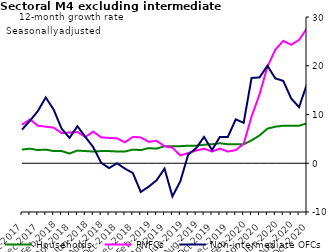
| Category | zero | Households | PNFCs | Non-intermediate OFCs |
|---|---|---|---|---|
| Oct-2017 | 0 | 2.8 | 7.9 | 6.9 |
| Nov-2017 | 0 | 3 | 9 | 8.7 |
| Dec-2017 | 0 | 2.7 | 7.7 | 10.7 |
| Jan-2018 | 0 | 2.8 | 7.5 | 13.5 |
| Feb-2018 | 0 | 2.5 | 7.3 | 11 |
| Mar-2018 | 0 | 2.5 | 6.2 | 7.1 |
| Apr-2018 | 0 | 2 | 6.3 | 5.2 |
| May-2018 | 0 | 2.6 | 6.4 | 7.6 |
| Jun-2018 | 0 | 2.5 | 5.4 | 5.4 |
| Jul-2018 | 0 | 2.4 | 6.5 | 3.3 |
| Aug-2018 | 0 | 2.5 | 5.3 | 0.1 |
| Sep-2018 | 0 | 2.5 | 5.2 | -1 |
| Oct-2018 | 0 | 2.4 | 5.1 | 0 |
| Nov-2018 | 0 | 2.4 | 4.3 | -1.1 |
| Dec-2018 | 0 | 2.8 | 5.4 | -2 |
| Jan-2019 | 0 | 2.7 | 5.3 | -5.9 |
| Feb-2019 | 0 | 3.1 | 4.4 | -4.8 |
| Mar-2019 | 0 | 3 | 4.6 | -3.5 |
| Apr-2019 | 0 | 3.5 | 3.5 | -1.1 |
| May-2019 | 0 | 3.5 | 3.2 | -6.8 |
| Jun-2019 | 0 | 3.5 | 1.6 | -3.7 |
| Jul-2019 | 0 | 3.6 | 2.1 | 1.8 |
| Aug-2019 | 0 | 3.6 | 2.6 | 3.1 |
| Sep-2019 | 0 | 3.8 | 3 | 5.4 |
| Oct-2019 | 0 | 3.9 | 2.4 | 2.7 |
| Nov-2019 | 0 | 4.1 | 3 | 5.4 |
| Dec-2019 | 0 | 3.9 | 2.4 | 5.4 |
| Jan-2020 | 0 | 3.9 | 2.7 | 9 |
| Feb-2020 | 0 | 3.9 | 4 | 8.3 |
| Mar-2020 | 0 | 4.7 | 9.6 | 17.5 |
| Apr-2020 | 0 | 5.7 | 14.1 | 17.6 |
| May-2020 | 0 | 7.1 | 19.8 | 20 |
| Jun-2020 | 0 | 7.5 | 23.3 | 17.4 |
| Jul-2020 | 0 | 7.7 | 25.1 | 16.9 |
| Aug-2020 | 0 | 7.7 | 24.3 | 13.3 |
| Sep-2020 | 0 | 7.7 | 25.3 | 11.5 |
| Oct-2020 | 0 | 8.2 | 27.7 | 16.3 |